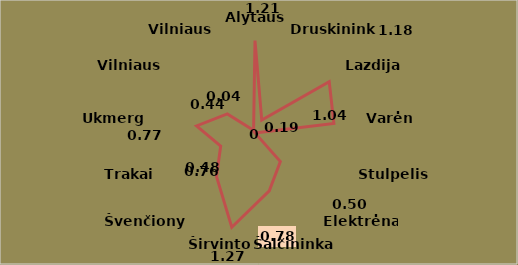
| Category | Series 0 |
|---|---|
| Alytaus r. | 1.21 |
| Druskininkai | 0.19 |
| Lazdijai | 1.18 |
| Varėna | 1.04 |
| Stulpelis1 | 0 |
| Elektrėnai | 0.5 |
| Šalčininkai | 0.78 |
| Širvintos | 1.27 |
| Švenčionys | 0.76 |
| Trakai | 0.48 |
| Ukmergė | 0.77 |
| Vilniaus r. | 0.44 |
| Vilniaus m. | 0.04 |